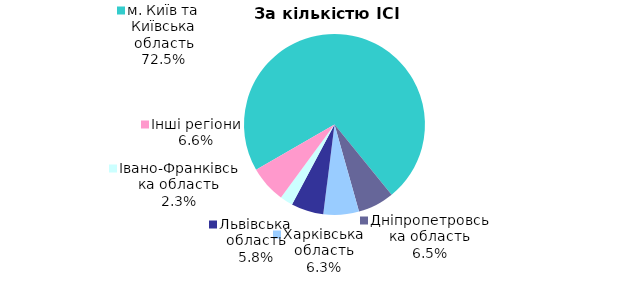
| Category | Series 0 |
|---|---|
| м. Київ та Київська область | 0.725 |
| Дніпропетровська область | 0.065 |
| Харківська область | 0.063 |
| Львівська область | 0.058 |
| Iвано-Франкiвська область | 0.023 |
| Інші регіони | 0.066 |